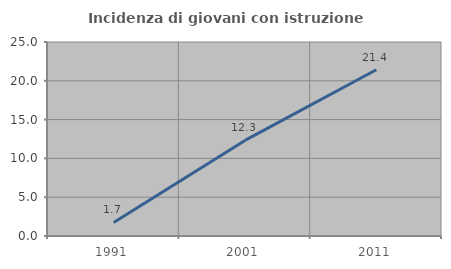
| Category | Incidenza di giovani con istruzione universitaria |
|---|---|
| 1991.0 | 1.746 |
| 2001.0 | 12.318 |
| 2011.0 | 21.429 |